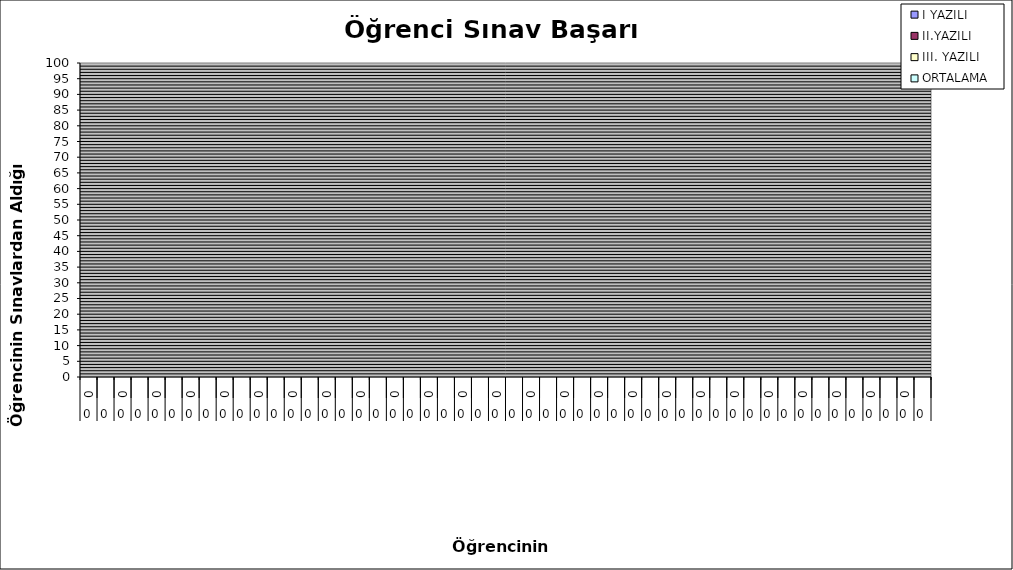
| Category | I YAZILI | II.YAZILI | III. YAZILI | ORTALAMA |
|---|---|---|---|---|
| 0 | 0 | 0 | 0 | 0 |
| 1 | 0 | 0 | 0 | 0 |
| 2 | 0 | 0 | 0 | 0 |
| 3 | 0 | 0 | 0 | 0 |
| 4 | 0 | 0 | 0 | 0 |
| 5 | 0 | 0 | 0 | 0 |
| 6 | 0 | 0 | 0 | 0 |
| 7 | 0 | 0 | 0 | 0 |
| 8 | 0 | 0 | 0 | 0 |
| 9 | 0 | 0 | 0 | 0 |
| 10 | 0 | 0 | 0 | 0 |
| 11 | 0 | 0 | 0 | 0 |
| 12 | 0 | 0 | 0 | 0 |
| 13 | 0 | 0 | 0 | 0 |
| 14 | 0 | 0 | 0 | 0 |
| 15 | 0 | 0 | 0 | 0 |
| 16 | 0 | 0 | 0 | 0 |
| 17 | 0 | 0 | 0 | 0 |
| 18 | 0 | 0 | 0 | 0 |
| 19 | 0 | 0 | 0 | 0 |
| 20 | 0 | 0 | 0 | 0 |
| 21 | 0 | 0 | 0 | 0 |
| 22 | 0 | 0 | 0 | 0 |
| 23 | 0 | 0 | 0 | 0 |
| 24 | 0 | 0 | 0 | 0 |
| 25 | 0 | 0 | 0 | 0 |
| 26 | 0 | 0 | 0 | 0 |
| 27 | 0 | 0 | 0 | 0 |
| 28 | 0 | 0 | 0 | 0 |
| 29 | 0 | 0 | 0 | 0 |
| 30 | 0 | 0 | 0 | 0 |
| 31 | 0 | 0 | 0 | 0 |
| 32 | 0 | 0 | 0 | 0 |
| 33 | 0 | 0 | 0 | 0 |
| 34 | 0 | 0 | 0 | 0 |
| 35 | 0 | 0 | 0 | 0 |
| 36 | 0 | 0 | 0 | 0 |
| 37 | 0 | 0 | 0 | 0 |
| 38 | 0 | 0 | 0 | 0 |
| 39 | 0 | 0 | 0 | 0 |
| 40 | 0 | 0 | 0 | 0 |
| 41 | 0 | 0 | 0 | 0 |
| 42 | 0 | 0 | 0 | 0 |
| 43 | 0 | 0 | 0 | 0 |
| 44 | 0 | 0 | 0 | 0 |
| 45 | 0 | 0 | 0 | 0 |
| 46 | 0 | 0 | 0 | 0 |
| 47 | 0 | 0 | 0 | 0 |
| 48 | 0 | 0 | 0 | 0 |
| 49 | 0 | 0 | 0 | 0 |